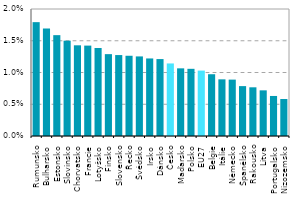
| Category | Series 0 |
|---|---|
| Rumunsko | 0.018 |
| Bulharsko | 0.017 |
| Estonsko | 0.016 |
| Slovinsko | 0.015 |
| Chorvatsko | 0.014 |
| Francie | 0.014 |
| Lotyšsko | 0.014 |
| Finsko | 0.013 |
| Slovensko | 0.013 |
| Řecko | 0.013 |
| Švédsko | 0.013 |
| Irsko | 0.012 |
| Dánsko | 0.012 |
| Česko | 0.011 |
| Maďarsko | 0.011 |
| Polsko | 0.011 |
| EU27 | 0.01 |
| Belgie | 0.01 |
| Itálie | 0.009 |
| Německo | 0.009 |
| Španělsko | 0.008 |
| Rakousko | 0.008 |
| Litva | 0.007 |
| Portugalsko | 0.006 |
| Nizozemsko | 0.006 |